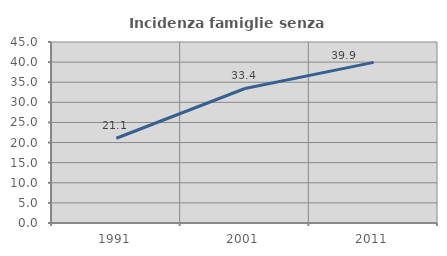
| Category | Incidenza famiglie senza nuclei |
|---|---|
| 1991.0 | 21.07 |
| 2001.0 | 33.439 |
| 2011.0 | 39.939 |